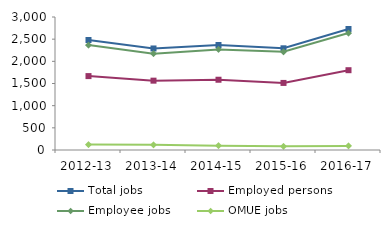
| Category | Total jobs | Employed persons | Employee jobs | OMUE jobs |
|---|---|---|---|---|
| 2012-13 | 2481 | 1667 | 2367 | 123 |
| 2013-14 | 2290 | 1564 | 2173 | 118 |
| 2014-15 | 2368 | 1585 | 2269 | 96 |
| 2015-16 | 2294 | 1513 | 2216 | 84 |
| 2016-17 | 2730 | 1800 | 2639 | 91 |